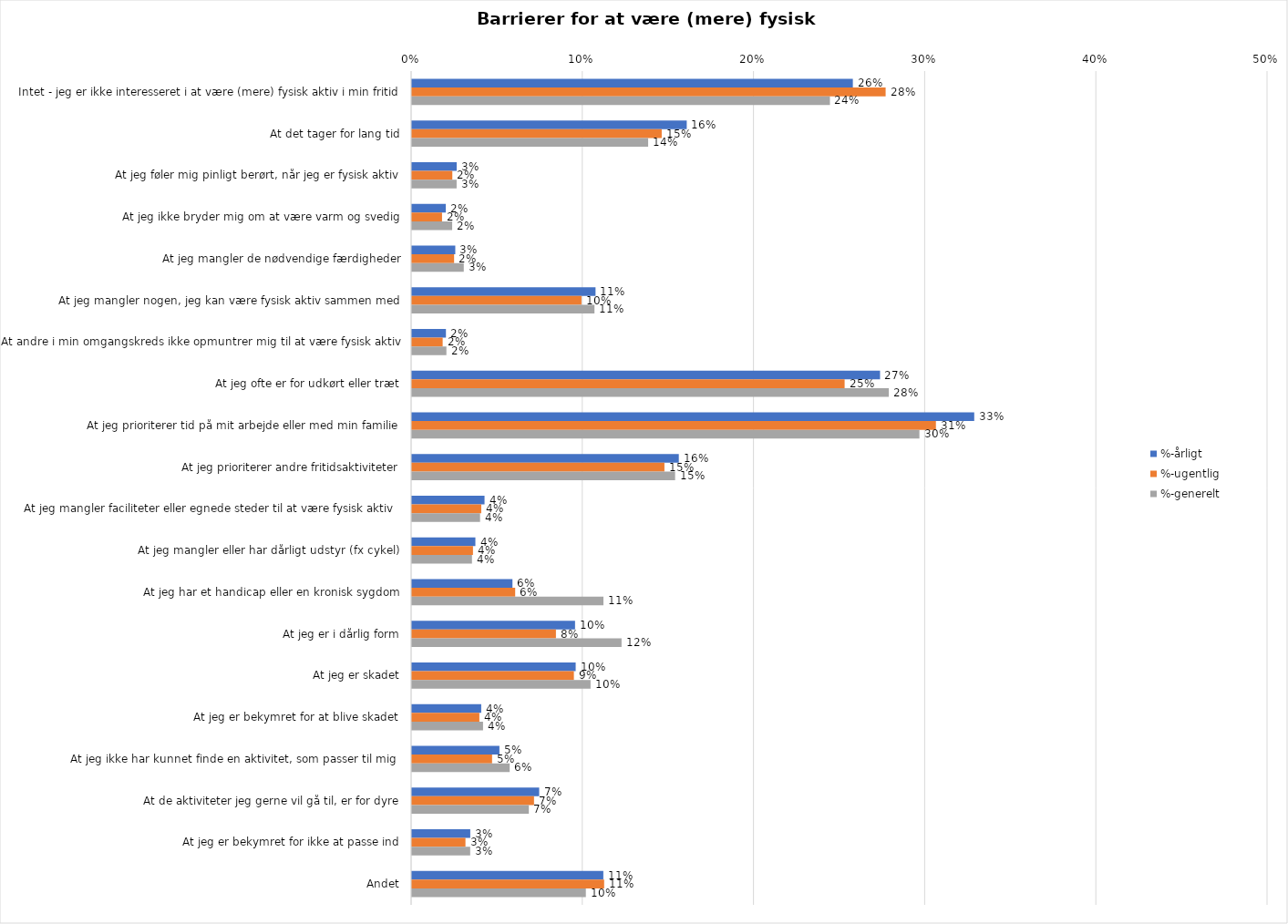
| Category | %-årligt | %-ugentlig | %-generelt |
|---|---|---|---|
| Intet - jeg er ikke interesseret i at være (mere) fysisk aktiv i min fritid | 0.258 | 0.277 | 0.244 |
| At det tager for lang tid | 0.16 | 0.146 | 0.138 |
| At jeg føler mig pinligt berørt, når jeg er fysisk aktiv | 0.026 | 0.024 | 0.026 |
| At jeg ikke bryder mig om at være varm og svedig | 0.02 | 0.018 | 0.023 |
| At jeg mangler de nødvendige færdigheder | 0.025 | 0.025 | 0.03 |
| At jeg mangler nogen, jeg kan være fysisk aktiv sammen med | 0.107 | 0.099 | 0.107 |
| At andre i min omgangskreds ikke opmuntrer mig til at være fysisk aktiv | 0.02 | 0.018 | 0.02 |
| At jeg ofte er for udkørt eller træt | 0.273 | 0.253 | 0.279 |
| At jeg prioriterer tid på mit arbejde eller med min familie | 0.328 | 0.306 | 0.296 |
| At jeg prioriterer andre fritidsaktiviteter | 0.156 | 0.147 | 0.154 |
| At jeg mangler faciliteter eller egnede steder til at være fysisk aktiv  | 0.042 | 0.04 | 0.04 |
| At jeg mangler eller har dårligt udstyr (fx cykel) | 0.037 | 0.036 | 0.035 |
| At jeg har et handicap eller en kronisk sygdom | 0.059 | 0.06 | 0.112 |
| At jeg er i dårlig form | 0.095 | 0.084 | 0.122 |
| At jeg er skadet | 0.096 | 0.095 | 0.104 |
| At jeg er bekymret for at blive skadet | 0.04 | 0.039 | 0.041 |
| At jeg ikke har kunnet finde en aktivitet, som passer til mig  | 0.051 | 0.047 | 0.057 |
| At de aktiviteter jeg gerne vil gå til, er for dyre | 0.074 | 0.071 | 0.068 |
| At jeg er bekymret for ikke at passe ind | 0.034 | 0.031 | 0.034 |
| Andet | 0.112 | 0.112 | 0.102 |